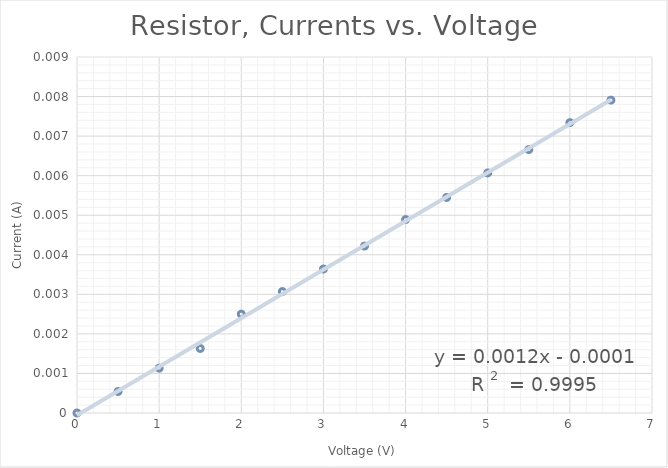
| Category | Series 0 |
|---|---|
| 0.5 | 0.001 |
| 1.0 | 0.001 |
| 1.5 | 0.002 |
| 2.0 | 0.002 |
| 2.5 | 0.003 |
| 3.0 | 0.004 |
| 3.5 | 0.004 |
| 4.0 | 0.005 |
| 4.5 | 0.005 |
| 5.0 | 0.006 |
| 5.5 | 0.007 |
| 6.0 | 0.007 |
| 6.5 | 0.008 |
| 0.0 | 0 |